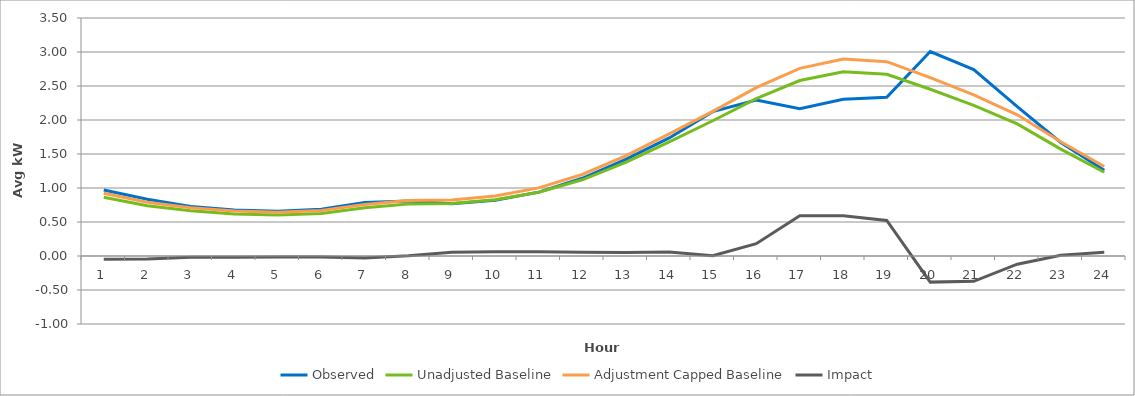
| Category | Observed | Unadjusted Baseline | Adjustment Capped Baseline | Impact |
|---|---|---|---|---|
| 0 | 0.971 | 0.863 | 0.923 | -0.049 |
| 1 | 0.833 | 0.739 | 0.791 | -0.043 |
| 2 | 0.73 | 0.665 | 0.711 | -0.019 |
| 3 | 0.678 | 0.617 | 0.66 | -0.018 |
| 4 | 0.657 | 0.601 | 0.643 | -0.013 |
| 5 | 0.686 | 0.627 | 0.67 | -0.016 |
| 6 | 0.788 | 0.709 | 0.759 | -0.029 |
| 7 | 0.811 | 0.763 | 0.816 | 0.005 |
| 8 | 0.77 | 0.771 | 0.824 | 0.054 |
| 9 | 0.82 | 0.826 | 0.883 | 0.063 |
| 10 | 0.939 | 0.937 | 1.002 | 0.062 |
| 11 | 1.143 | 1.121 | 1.199 | 0.055 |
| 12 | 1.422 | 1.378 | 1.474 | 0.051 |
| 13 | 1.736 | 1.679 | 1.796 | 0.059 |
| 14 | 2.124 | 1.989 | 2.127 | 0.003 |
| 15 | 2.294 | 2.315 | 2.476 | 0.181 |
| 16 | 2.166 | 2.58 | 2.759 | 0.593 |
| 17 | 2.306 | 2.71 | 2.898 | 0.591 |
| 18 | 2.334 | 2.672 | 2.857 | 0.523 |
| 19 | 3.006 | 2.452 | 2.622 | -0.384 |
| 20 | 2.742 | 2.216 | 2.37 | -0.372 |
| 21 | 2.197 | 1.942 | 2.076 | -0.121 |
| 22 | 1.67 | 1.572 | 1.681 | 0.01 |
| 23 | 1.263 | 1.231 | 1.317 | 0.054 |